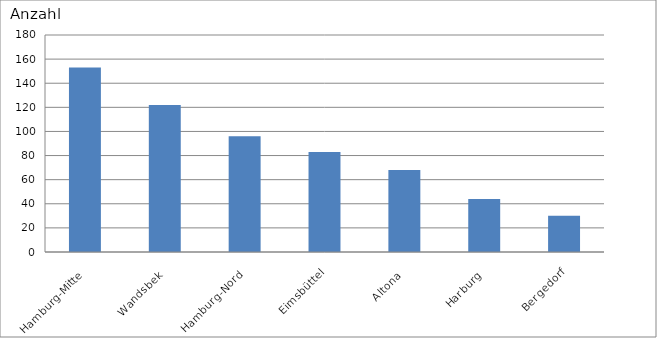
| Category | Hamburg-Mitte Wandsbek Hamburg-Nord Eimsbüttel Altona Harburg Bergedorf |
|---|---|
| Hamburg-Mitte | 153 |
| Wandsbek | 122 |
| Hamburg-Nord | 96 |
| Eimsbüttel | 83 |
| Altona | 68 |
| Harburg | 44 |
| Bergedorf | 30 |